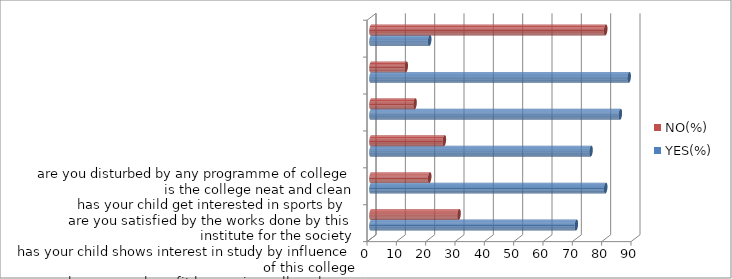
| Category | YES(%) | NO(%) |
|---|---|---|
| 0 | 70 | 30 |
| 1 | 80 | 20 |
| 2 | 75 | 25 |
| 3 | 85 | 15 |
| 4 | 88 | 12 |
| 5 | 20 | 80 |